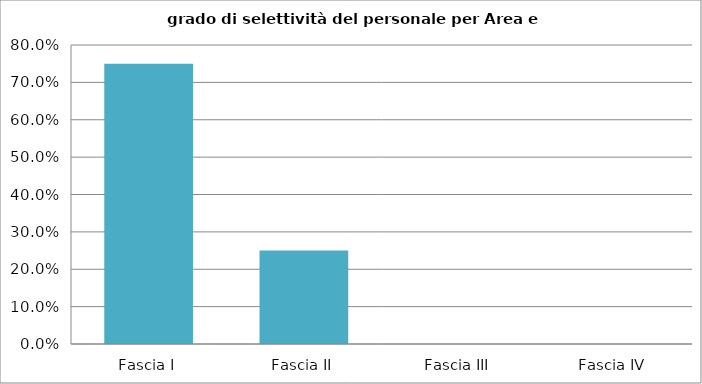
| Category | Totale ente |
|---|---|
| Fascia I | 0.75 |
| Fascia II | 0.25 |
| Fascia III | 0 |
| Fascia IV | 0 |